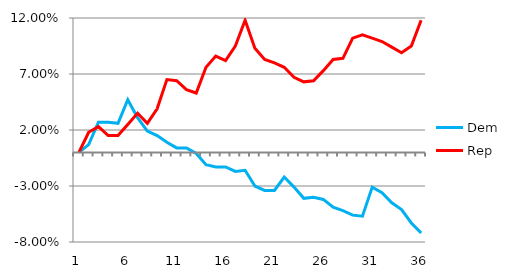
| Category | Dem | Rep |
|---|---|---|
| 0 | 0 | 0 |
| 1 | 0.007 | 0.018 |
| 2 | 0.027 | 0.023 |
| 3 | 0.027 | 0.015 |
| 4 | 0.026 | 0.015 |
| 5 | 0.047 | 0.025 |
| 6 | 0.031 | 0.035 |
| 7 | 0.019 | 0.026 |
| 8 | 0.015 | 0.039 |
| 9 | 0.009 | 0.065 |
| 10 | 0.004 | 0.064 |
| 11 | 0.004 | 0.056 |
| 12 | -0.001 | 0.053 |
| 13 | -0.011 | 0.076 |
| 14 | -0.013 | 0.086 |
| 15 | -0.013 | 0.082 |
| 16 | -0.017 | 0.095 |
| 17 | -0.016 | 0.118 |
| 18 | -0.03 | 0.093 |
| 19 | -0.034 | 0.083 |
| 20 | -0.034 | 0.08 |
| 21 | -0.022 | 0.076 |
| 22 | -0.031 | 0.067 |
| 23 | -0.041 | 0.063 |
| 24 | -0.04 | 0.064 |
| 25 | -0.042 | 0.073 |
| 26 | -0.049 | 0.083 |
| 27 | -0.052 | 0.084 |
| 28 | -0.056 | 0.102 |
| 29 | -0.057 | 0.105 |
| 30 | -0.031 | 0.102 |
| 31 | -0.036 | 0.099 |
| 32 | -0.045 | 0.094 |
| 33 | -0.051 | 0.089 |
| 34 | -0.063 | 0.095 |
| 35 | -0.072 | 0.118 |